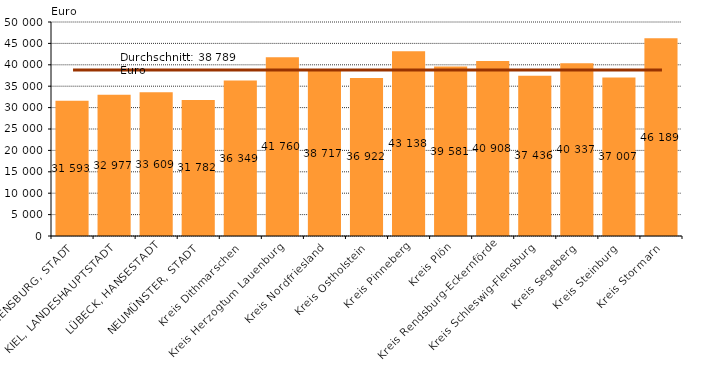
| Category | Series 0 |
|---|---|
| FLENSBURG, STADT | 31593 |
| KIEL, LANDESHAUPTSTADT | 32977 |
| LÜBECK, HANSESTADT | 33609 |
| NEUMÜNSTER, STADT | 31782 |
| Kreis Dithmarschen | 36349 |
| Kreis Herzogtum Lauenburg | 41760 |
| Kreis Nordfriesland | 38717 |
| Kreis Ostholstein | 36922 |
| Kreis Pinneberg | 43138 |
| Kreis Plön | 39581 |
| Kreis Rendsburg-Eckernförde | 40908 |
| Kreis Schleswig-Flensburg | 37436 |
| Kreis Segeberg | 40337 |
| Kreis Steinburg | 37007 |
| Kreis Stormarn | 46189 |